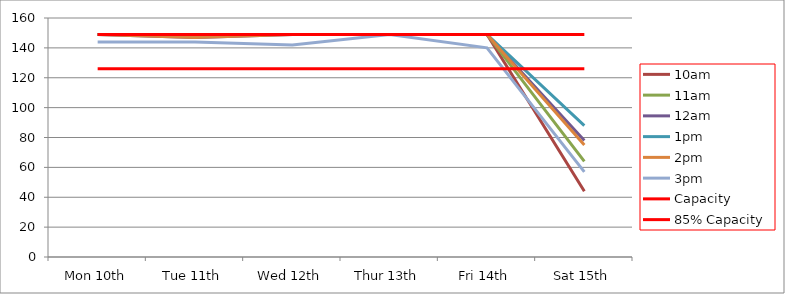
| Category | 9am | 10am | 11am | 12am | 1pm | 2pm | 3pm | 4pm | 5pm | Capacity | 85% Capacity |
|---|---|---|---|---|---|---|---|---|---|---|---|
| Mon 10th |  | 149 | 149 | 149 | 149 | 149 | 144 |  |  | 149 | 126 |
| Tue 11th |  | 149 | 149 | 147 | 149 | 147 | 144 |  |  | 149 | 126 |
| Wed 12th |  | 149 | 149 | 149 | 149 | 149 | 142 |  |  | 149 | 126 |
| Thur 13th |  | 149 | 149 | 149 | 149 | 149 | 149 |  |  | 149 | 126 |
| Fri 14th |  | 149 | 149 | 149 | 149 | 149 | 140 |  |  | 149 | 126 |
| Sat 15th |  | 44 | 64 | 78 | 88 | 75 | 57 |  |  | 149 | 126 |